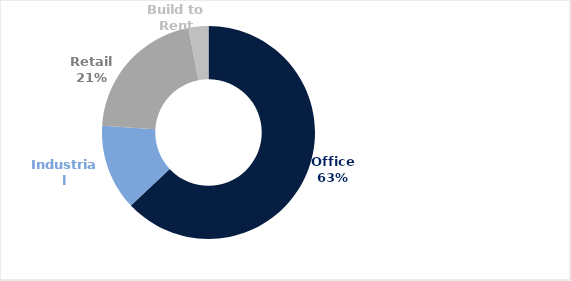
| Category | Series 0 |
|---|---|
| Office | 0.63 |
| Industrial | 0.13 |
| Retail | 0.21 |
| Build to Rent | 0.03 |